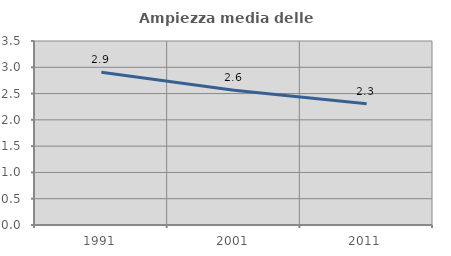
| Category | Ampiezza media delle famiglie |
|---|---|
| 1991.0 | 2.908 |
| 2001.0 | 2.564 |
| 2011.0 | 2.307 |